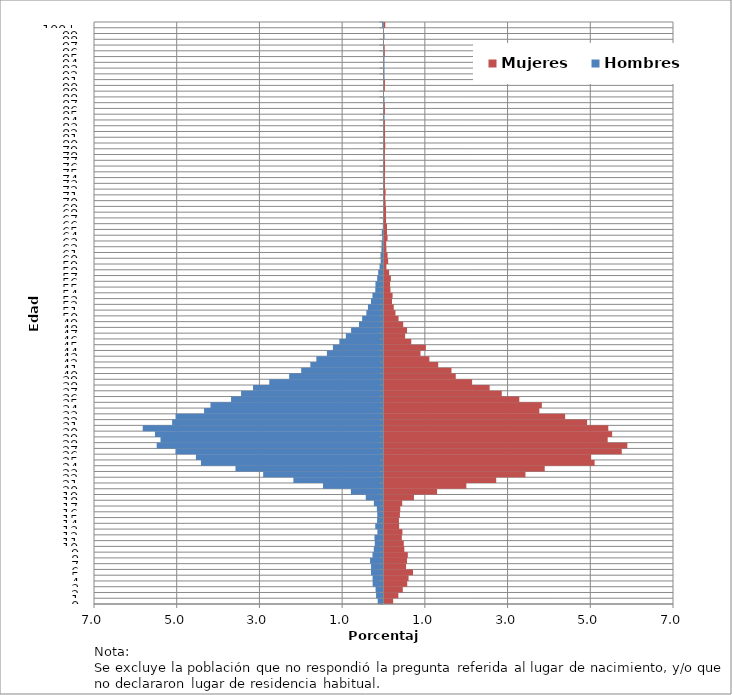
| Category | Hombres | Mujeres |
|---|---|---|
| 0 | -0.141 | 0.21 |
| 1 | -0.18 | 0.335 |
| 2 | -0.192 | 0.442 |
| 3 | -0.262 | 0.549 |
| 4 | -0.265 | 0.582 |
| 5 | -0.303 | 0.689 |
| 6 | -0.301 | 0.522 |
| 7 | -0.325 | 0.545 |
| 8 | -0.267 | 0.563 |
| 9 | -0.235 | 0.48 |
| 10 | -0.211 | 0.466 |
| 11 | -0.218 | 0.419 |
| 12 | -0.148 | 0.433 |
| 13 | -0.199 | 0.354 |
| 14 | -0.155 | 0.349 |
| 15 | -0.15 | 0.373 |
| 16 | -0.16 | 0.382 |
| 17 | -0.233 | 0.428 |
| 18 | -0.43 | 0.712 |
| 19 | -0.789 | 1.271 |
| 20 | -1.463 | 1.979 |
| 21 | -2.179 | 2.701 |
| 22 | -2.91 | 3.409 |
| 23 | -3.579 | 3.874 |
| 24 | -4.414 | 5.08 |
| 25 | -4.536 | 4.997 |
| 26 | -5.031 | 5.737 |
| 27 | -5.484 | 5.872 |
| 28 | -5.392 | 5.397 |
| 29 | -5.526 | 5.504 |
| 30 | -5.822 | 5.411 |
| 31 | -5.111 | 4.899 |
| 32 | -5.028 | 4.368 |
| 33 | -4.339 | 3.744 |
| 34 | -4.184 | 3.804 |
| 35 | -3.686 | 3.26 |
| 36 | -3.444 | 2.836 |
| 37 | -3.155 | 2.542 |
| 38 | -2.762 | 2.119 |
| 39 | -2.281 | 1.723 |
| 40 | -1.99 | 1.62 |
| 41 | -1.769 | 1.299 |
| 42 | -1.623 | 1.085 |
| 43 | -1.369 | 0.871 |
| 44 | -1.223 | 1.001 |
| 45 | -1.068 | 0.647 |
| 46 | -0.91 | 0.498 |
| 47 | -0.784 | 0.545 |
| 48 | -0.592 | 0.452 |
| 49 | -0.517 | 0.34 |
| 50 | -0.415 | 0.265 |
| 51 | -0.376 | 0.224 |
| 52 | -0.303 | 0.182 |
| 53 | -0.267 | 0.196 |
| 54 | -0.199 | 0.144 |
| 55 | -0.194 | 0.135 |
| 56 | -0.153 | 0.154 |
| 57 | -0.129 | 0.112 |
| 58 | -0.095 | 0.047 |
| 59 | -0.068 | 0.088 |
| 60 | -0.073 | 0.075 |
| 61 | -0.051 | 0.047 |
| 62 | -0.046 | 0.042 |
| 63 | -0.032 | 0.075 |
| 64 | -0.041 | 0.061 |
| 65 | -0.017 | 0.061 |
| 66 | -0.015 | 0.037 |
| 67 | -0.005 | 0.037 |
| 68 | -0.002 | 0.037 |
| 69 | -0.007 | 0.028 |
| 70 | -0.007 | 0.019 |
| 71 | -0.002 | 0.028 |
| 72 | -0.007 | 0.009 |
| 73 | -0.005 | 0.009 |
| 74 | -0.015 | 0.009 |
| 75 | -0.005 | 0.014 |
| 76 | -0.007 | 0.014 |
| 77 | -0.007 | 0.005 |
| 78 | -0.007 | 0.009 |
| 79 | -0.01 | 0.019 |
| 80 | -0.002 | 0.009 |
| 81 | -0.007 | 0.014 |
| 82 | -0.01 | 0.009 |
| 83 | -0.01 | 0.009 |
| 84 | -0.007 | 0 |
| 85 | -0.002 | 0.009 |
| 86 | -0.007 | 0.005 |
| 87 | -0.002 | 0 |
| 88 | 0 | 0 |
| 89 | 0 | 0.009 |
| 90 | -0.005 | 0.009 |
| 91 | -0.002 | 0 |
| 92 | -0.002 | 0 |
| 93 | -0.007 | 0 |
| 94 | -0.002 | 0 |
| 95 | -0.002 | 0.005 |
| 96 | 0 | 0.005 |
| 97 | 0 | 0 |
| 98 | -0.002 | 0 |
| 99 | 0 | 0 |
| 100+ | -0.034 | 0.019 |